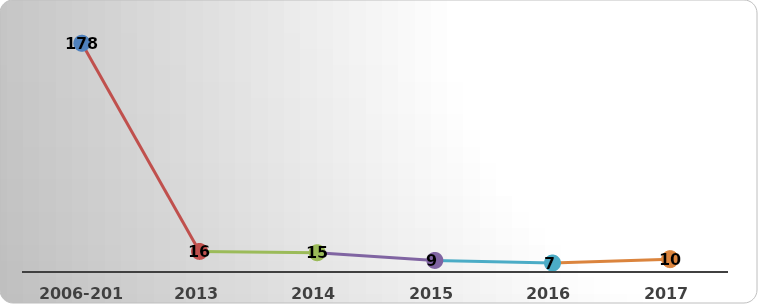
| Category | Total |
|---|---|
| 2006-2012 | 178 |
| 2013 | 16 |
| 2014 | 15 |
| 2015 | 9 |
| 2016 | 7 |
| 2017 | 10 |